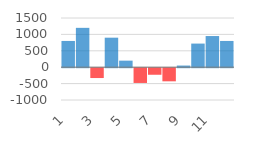
| Category | Series 0 |
|---|---|
| 1.0 | 800 |
| 2.0 | 1200 |
| 3.0 | -300 |
| 4.0 | 900 |
| 5.0 | 200 |
| 6.0 | -450 |
| 7.0 | -200 |
| 8.0 | -400 |
| 9.0 | 50 |
| 10.0 | 720 |
| 11.0 | 950 |
| 12.0 | 800 |